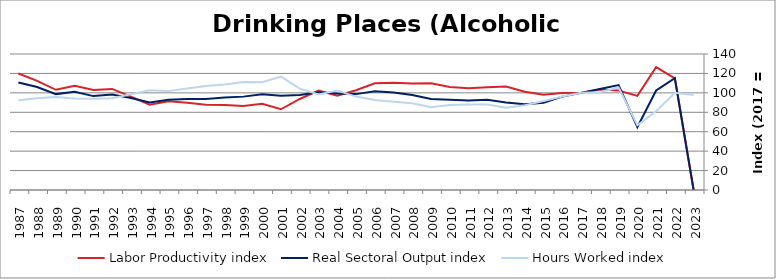
| Category | Labor Productivity index | Real Sectoral Output index | Hours Worked index |
|---|---|---|---|
| 2023.0 | 0 | 0 | 97.69 |
| 2022.0 | 115.008 | 115.056 | 100.042 |
| 2021.0 | 126.391 | 102.411 | 81.027 |
| 2020.0 | 96.867 | 64.633 | 66.724 |
| 2019.0 | 102.378 | 108.06 | 105.551 |
| 2018.0 | 103.372 | 103.969 | 100.578 |
| 2017.0 | 100 | 100 | 100 |
| 2016.0 | 99.833 | 96.148 | 96.308 |
| 2015.0 | 98.026 | 89.738 | 91.545 |
| 2014.0 | 101.124 | 88.265 | 87.284 |
| 2013.0 | 106.446 | 90.118 | 84.661 |
| 2012.0 | 105.72 | 92.988 | 87.957 |
| 2011.0 | 104.67 | 92.019 | 87.913 |
| 2010.0 | 106.103 | 92.965 | 87.618 |
| 2009.0 | 109.997 | 93.787 | 85.263 |
| 2008.0 | 109.628 | 97.875 | 89.28 |
| 2007.0 | 110.329 | 100.283 | 90.895 |
| 2006.0 | 109.837 | 101.686 | 92.579 |
| 2005.0 | 102.658 | 98.703 | 96.147 |
| 2004.0 | 97.013 | 99.396 | 102.457 |
| 2003.0 | 102.292 | 100.706 | 98.449 |
| 2002.0 | 93.685 | 97.797 | 104.389 |
| 2001.0 | 83.101 | 97.026 | 116.756 |
| 2000.0 | 88.714 | 98.442 | 110.966 |
| 1999.0 | 86.552 | 96.122 | 111.058 |
| 1998.0 | 87.574 | 95.138 | 108.638 |
| 1997.0 | 87.669 | 93.78 | 106.971 |
| 1996.0 | 89.817 | 93.766 | 104.397 |
| 1995.0 | 91.346 | 92.979 | 101.787 |
| 1994.0 | 87.719 | 90.062 | 102.671 |
| 1993.0 | 96.126 | 94.802 | 98.622 |
| 1992.0 | 104.068 | 98.381 | 94.535 |
| 1991.0 | 102.966 | 96.648 | 93.864 |
| 1990.0 | 107.266 | 101.132 | 94.281 |
| 1989.0 | 103.147 | 98.718 | 95.706 |
| 1988.0 | 112.31 | 106.012 | 94.392 |
| 1987.0 | 119.968 | 110.726 | 92.296 |